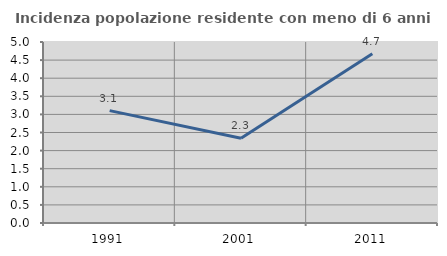
| Category | Incidenza popolazione residente con meno di 6 anni |
|---|---|
| 1991.0 | 3.105 |
| 2001.0 | 2.343 |
| 2011.0 | 4.675 |